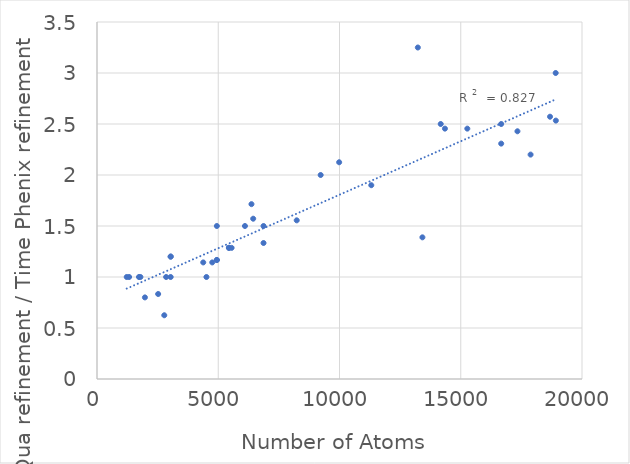
| Category | Ratio: Time Aqua / Time Phenix |
|---|---|
| 2522.0 | 0.833 |
| 2774.0 | 0.625 |
| 2851.0 | 1 |
| 1731.0 | 1 |
| 13230.0 | 3.25 |
| 1976.0 | 0.8 |
| 6867.0 | 1.333 |
| 6867.0 | 1.5 |
| 5551.0 | 1.286 |
| 6441.0 | 1.571 |
| 1324.0 | 1 |
| 8236.0 | 1.556 |
| 4381.0 | 1.143 |
| 18922.0 | 2.533 |
| 17880.0 | 2.2 |
| 17338.0 | 2.429 |
| 14348.0 | 2.455 |
| 9986.0 | 2.125 |
| 4513.0 | 1 |
| 5440.0 | 1.286 |
| 5440.0 | 1.286 |
| 1226.0 | 1 |
| 13419.0 | 1.389 |
| 4753.0 | 1.143 |
| 9223.0 | 2 |
| 6101.0 | 1.5 |
| 18915.0 | 3 |
| 18682.0 | 2.571 |
| 6370.0 | 1.714 |
| 11311.0 | 1.9 |
| 3038.0 | 1 |
| 3038.0 | 1.2 |
| 3038.0 | 1.2 |
| 16668.0 | 2.308 |
| 16668.0 | 2.5 |
| 15271.0 | 2.455 |
| 14174.0 | 2.5 |
| 1791.0 | 1 |
| 4943.0 | 1.167 |
| 4942.0 | 1.167 |
| 4942.0 | 1.5 |